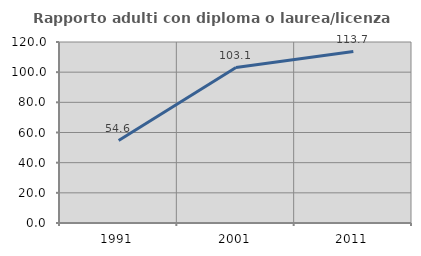
| Category | Rapporto adulti con diploma o laurea/licenza media  |
|---|---|
| 1991.0 | 54.641 |
| 2001.0 | 103.069 |
| 2011.0 | 113.701 |